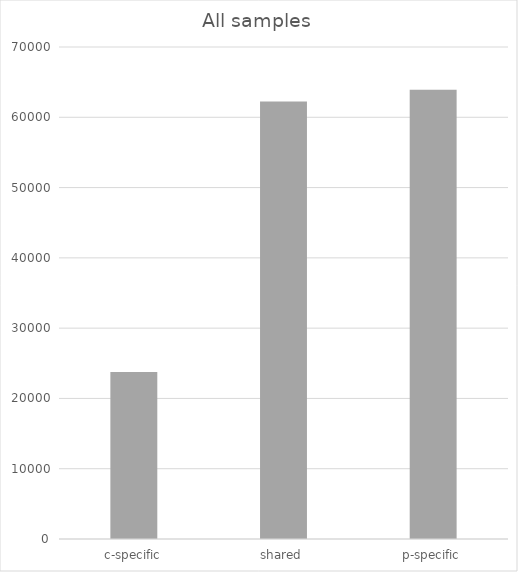
| Category | All samples |
|---|---|
| c-specific | 23745 |
| shared | 62238 |
| p-specific | 63920 |